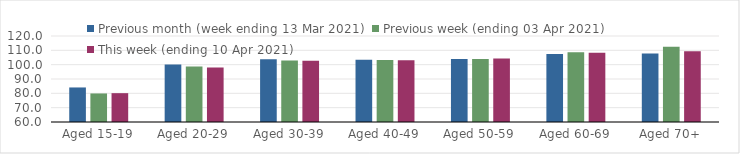
| Category | Previous month (week ending 13 Mar 2021) | Previous week (ending 03 Apr 2021) | This week (ending 10 Apr 2021) |
|---|---|---|---|
| Aged 15-19 | 84.1 | 79.91 | 80.12 |
| Aged 20-29 | 100.05 | 98.7 | 98.11 |
| Aged 30-39 | 103.79 | 102.84 | 102.78 |
| Aged 40-49 | 103.48 | 103.17 | 103.13 |
| Aged 50-59 | 104.03 | 103.94 | 104.23 |
| Aged 60-69 | 107.37 | 108.6 | 108.37 |
| Aged 70+ | 107.76 | 112.53 | 109.37 |